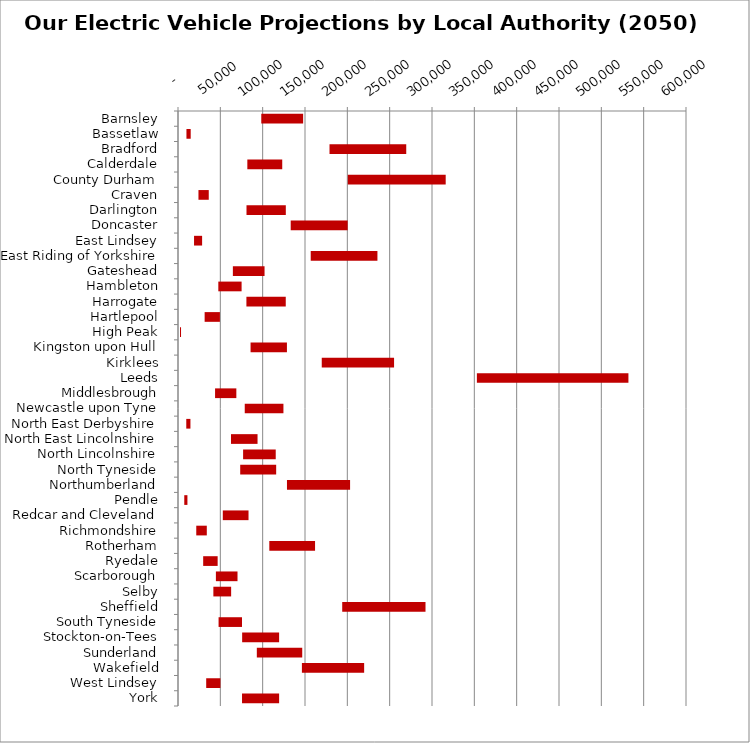
| Category | MIN | MAX |
|---|---|---|
| Barnsley | 98361 | 49433 |
| Bassetlaw | 9976 | 5022 |
| Bradford | 178952 | 90624 |
| Calderdale | 81893 | 41221 |
| County Durham | 200543 | 115634 |
| Craven | 24164 | 12156 |
| Darlington | 80911 | 46428 |
| Doncaster | 133117 | 67282 |
| East Lindsey | 18944 | 9533 |
| East Riding of Yorkshire | 156755 | 78789 |
| Gateshead | 64804 | 37420 |
| Hambleton | 47620 | 27494 |
| Harrogate | 80795 | 46476 |
| Hartlepool | 31455 | 18063 |
| High Peak | 2367 | 1208 |
| Kingston upon Hull | 85713 | 42945 |
| Kirklees | 169782 | 85419 |
| Leeds | 353003 | 178994 |
| Middlesbrough | 43777 | 25129 |
| Newcastle upon Tyne | 78834 | 45690 |
| North East Derbyshire | 9772 | 4913 |
| North East Lincolnshire | 62570 | 31376 |
| North Lincolnshire | 76892 | 38541 |
| North Tyneside | 73475 | 42475 |
| Northumberland | 128702 | 74547 |
| Pendle | 7407 | 3719 |
| Redcar and Cleveland | 52903 | 30394 |
| Richmondshire | 21572 | 12442 |
| Rotherham | 107841 | 54033 |
| Ryedale | 29734 | 17094 |
| Scarborough | 44753 | 25532 |
| Selby | 41766 | 20995 |
| Sheffield | 193957 | 98375 |
| South Tyneside | 47925 | 27648 |
| Stockton-on-Tees | 75770 | 43668 |
| Sunderland | 93096 | 53634 |
| Wakefield | 146338 | 73519 |
| West Lindsey | 33298 | 16807 |
| York | 75621 | 43814 |